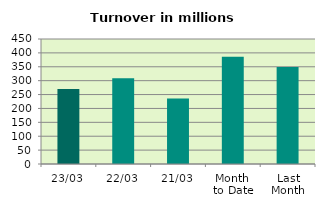
| Category | Series 0 |
|---|---|
| 23/03 | 270.143 |
| 22/03 | 308.748 |
| 21/03 | 235.502 |
| Month 
to Date | 386.457 |
| Last
Month | 349.641 |